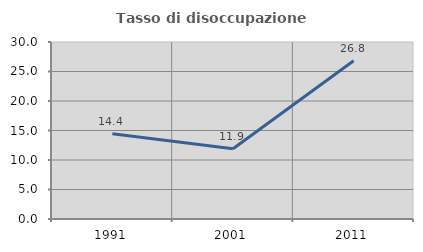
| Category | Tasso di disoccupazione giovanile  |
|---|---|
| 1991.0 | 14.437 |
| 2001.0 | 11.917 |
| 2011.0 | 26.829 |